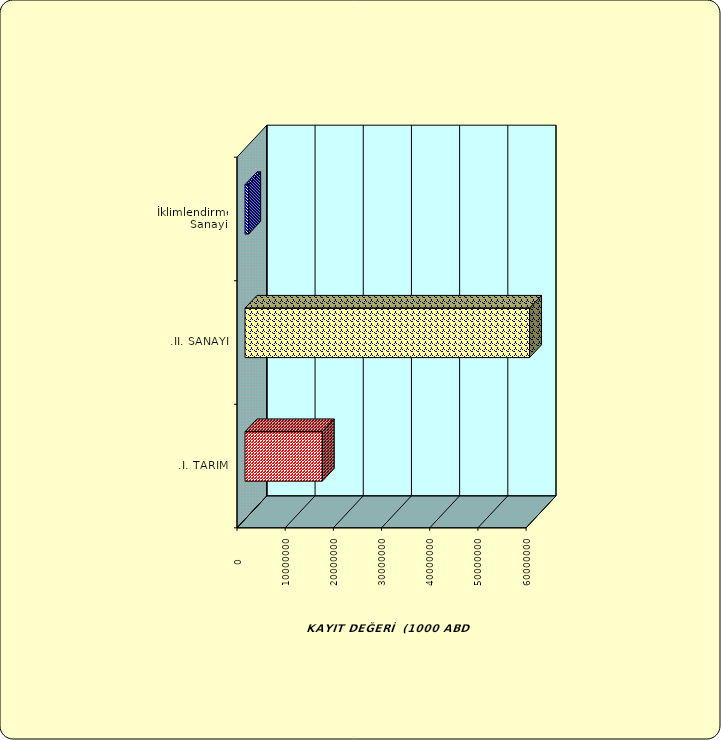
| Category | Series 0 |
|---|---|
| .I. TARIM | 16036762.878 |
| .II. SANAYİ | 59053108.342 |
|  İklimlendirme Sanayii | 764022.057 |